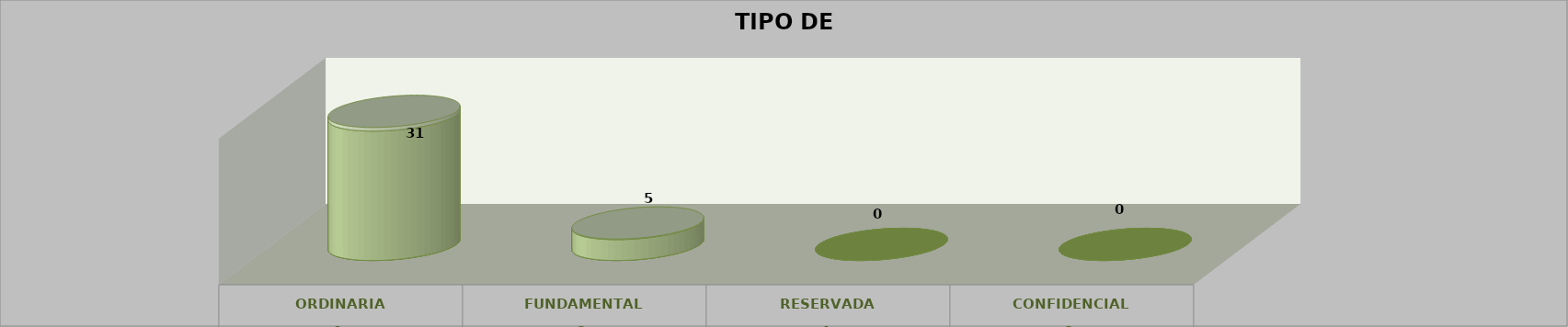
| Category | Series 0 | Series 2 | Series 1 | Series 3 | Series 4 |
|---|---|---|---|---|---|
| 0 |  |  |  | 31 | 0.861 |
| 1 |  |  |  | 5 | 0.139 |
| 2 |  |  |  | 0 | 0 |
| 3 |  |  |  | 0 | 0 |